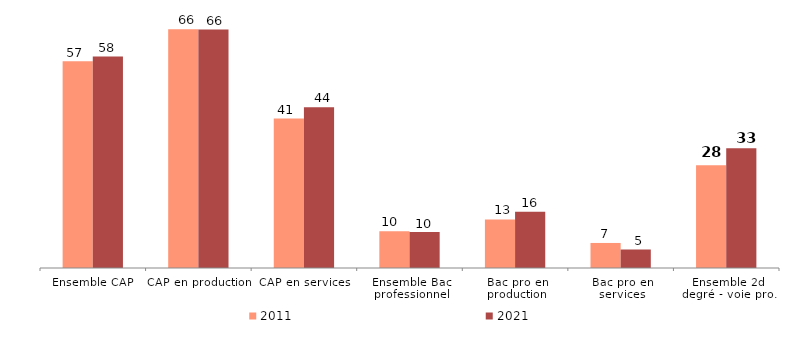
| Category | 2011 | 2021 |
|---|---|---|
| Ensemble CAP | 57 | 58.3 |
| CAP en production | 65.8 | 65.7 |
| CAP en services | 41.2 | 44.3 |
| Ensemble Bac professionnel | 10.1 | 9.9 |
| Bac pro en production | 13.4 | 15.5 |
| Bac pro en services | 6.9 | 5.1 |
| Ensemble 2d degré - voie pro. | 28.3 | 33 |